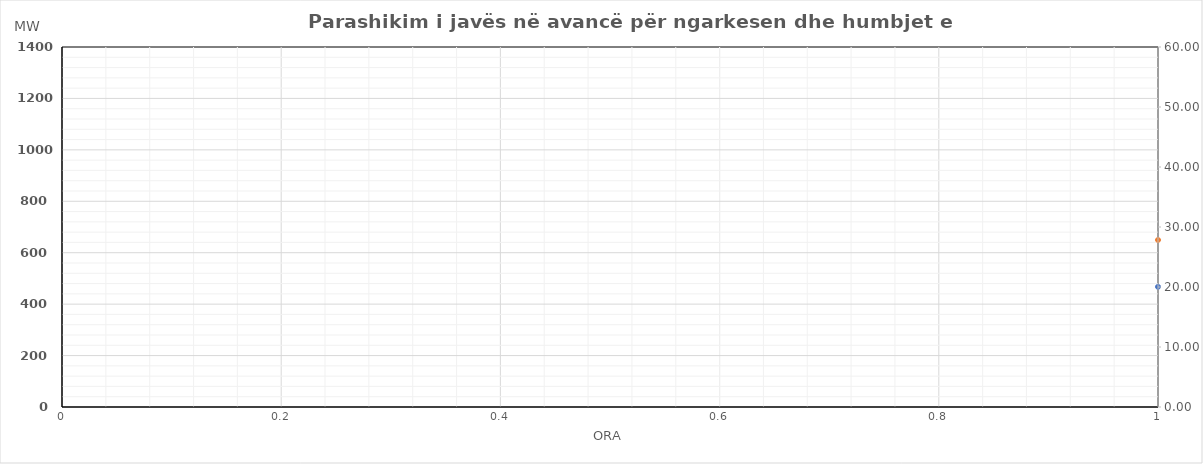
| Category | Ngarkesa (MWh) |
|---|---|
| 0 | 649.57 |
| 1 | 566.77 |
| 2 | 530.97 |
| 3 | 519.79 |
| 4 | 531.88 |
| 5 | 600.25 |
| 6 | 780.59 |
| 7 | 1034.04 |
| 8 | 1104.43 |
| 9 | 1072.03 |
| 10 | 1007.93 |
| 11 | 968.11 |
| 12 | 951.42 |
| 13 | 975.71 |
| 14 | 996.43 |
| 15 | 1006.42 |
| 16 | 1041.52 |
| 17 | 1188.85 |
| 18 | 1265.29 |
| 19 | 1263.51 |
| 20 | 1230.12 |
| 21 | 1118.29 |
| 22 | 958.85 |
| 23 | 776.54 |
| 24 | 625.73 |
| 25 | 550.95 |
| 26 | 522.54 |
| 27 | 513.73 |
| 28 | 525.83 |
| 29 | 591.62 |
| 30 | 780.44 |
| 31 | 1044.5 |
| 32 | 1095.35 |
| 33 | 1055.66 |
| 34 | 990.95 |
| 35 | 955.19 |
| 36 | 944.01 |
| 37 | 1021.11 |
| 38 | 1047.68 |
| 39 | 1059.54 |
| 40 | 1081.54 |
| 41 | 1168.46 |
| 42 | 1246.29 |
| 43 | 1247.3 |
| 44 | 1219.51 |
| 45 | 1109.32 |
| 46 | 953.31 |
| 47 | 774.32 |
| 48 | 686.55 |
| 49 | 587.17 |
| 50 | 531.35 |
| 51 | 518.95 |
| 52 | 527.35 |
| 53 | 595.83 |
| 54 | 787.94 |
| 55 | 1041.8 |
| 56 | 1100.95 |
| 57 | 1070.66 |
| 58 | 1006.15 |
| 59 | 959.19 |
| 60 | 938.01 |
| 61 | 939.21 |
| 62 | 924.68 |
| 63 | 946.14 |
| 64 | 982.54 |
| 65 | 1135.1 |
| 66 | 1281.02 |
| 67 | 1279.04 |
| 68 | 1245.33 |
| 69 | 1135.34 |
| 70 | 971.96 |
| 71 | 780.46 |
| 72 | 641.95 |
| 73 | 563.15 |
| 74 | 527.65 |
| 75 | 513.36 |
| 76 | 524.55 |
| 77 | 595.57 |
| 78 | 793.99 |
| 79 | 1054.67 |
| 80 | 1090.52 |
| 81 | 1037.14 |
| 82 | 963.14 |
| 83 | 914.11 |
| 84 | 896.61 |
| 85 | 916.44 |
| 86 | 937.02 |
| 87 | 1001.27 |
| 88 | 1048.68 |
| 89 | 1194.42 |
| 90 | 1289.03 |
| 91 | 1287.56 |
| 92 | 1253.46 |
| 93 | 1143.55 |
| 94 | 969.75 |
| 95 | 777.77 |
| 96 | 614.25 |
| 97 | 545.75 |
| 98 | 516.23 |
| 99 | 504.83 |
| 100 | 513.23 |
| 101 | 599.34 |
| 102 | 781.88 |
| 103 | 1019.36 |
| 104 | 1081.78 |
| 105 | 1047.11 |
| 106 | 989.6 |
| 107 | 957.78 |
| 108 | 951.49 |
| 109 | 942.68 |
| 110 | 977.85 |
| 111 | 983.93 |
| 112 | 1019.46 |
| 113 | 1177.05 |
| 114 | 1238.77 |
| 115 | 1237.16 |
| 116 | 1205.36 |
| 117 | 1097.37 |
| 118 | 946.15 |
| 119 | 781.05 |
| 120 | 640.88 |
| 121 | 567.68 |
| 122 | 533.36 |
| 123 | 519.88 |
| 124 | 525.37 |
| 125 | 579.99 |
| 126 | 709.42 |
| 127 | 884.2 |
| 128 | 1037.05 |
| 129 | 1086.18 |
| 130 | 1094.28 |
| 131 | 1073.83 |
| 132 | 1071.17 |
| 133 | 1084.65 |
| 134 | 1090.15 |
| 135 | 1111.21 |
| 136 | 1125.41 |
| 137 | 1196.59 |
| 138 | 1219.3 |
| 139 | 1155.42 |
| 140 | 1107.91 |
| 141 | 1002.75 |
| 142 | 868.75 |
| 143 | 730.85 |
| 144 | 640.7 |
| 145 | 561.9 |
| 146 | 510.17 |
| 147 | 485.78 |
| 148 | 485.38 |
| 149 | 520 |
| 150 | 612.92 |
| 151 | 749.1 |
| 152 | 907.05 |
| 153 | 1006.38 |
| 154 | 1055.28 |
| 155 | 1081.47 |
| 156 | 1040.27 |
| 157 | 1039.65 |
| 158 | 1022.75 |
| 159 | 1031.21 |
| 160 | 1076.81 |
| 161 | 1209.6 |
| 162 | 1244 |
| 163 | 1246.32 |
| 164 | 1217.23 |
| 165 | 1107.25 |
| 166 | 944.56 |
| 167 | 758.36 |